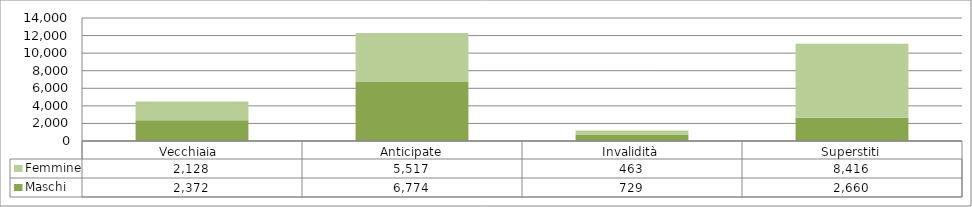
| Category | Maschi | Femmine |
|---|---|---|
| Vecchiaia  | 2372 | 2128 |
| Anticipate | 6774 | 5517 |
| Invalidità | 729 | 463 |
| Superstiti | 2660 | 8416 |